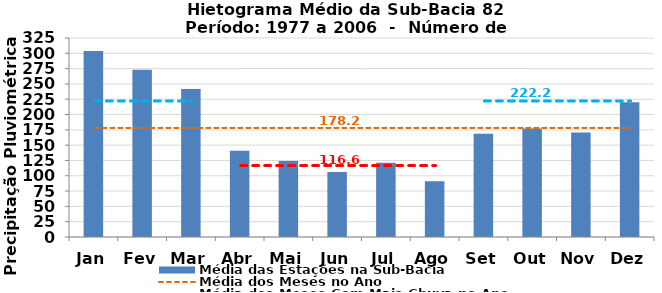
| Category | Média das Estações na Sub-Bacia |
|---|---|
| Jan | 303.726 |
| Fev | 273.204 |
| Mar | 241.769 |
| Abr | 140.778 |
| Mai | 124.139 |
| Jun | 105.996 |
| Jul | 121.308 |
| Ago | 90.915 |
| Set | 168.726 |
| Out | 177.248 |
| Nov | 170.471 |
| Dez | 219.941 |